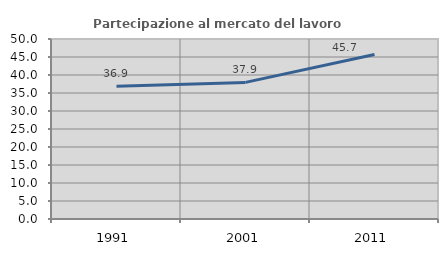
| Category | Partecipazione al mercato del lavoro  femminile |
|---|---|
| 1991.0 | 36.886 |
| 2001.0 | 37.946 |
| 2011.0 | 45.719 |